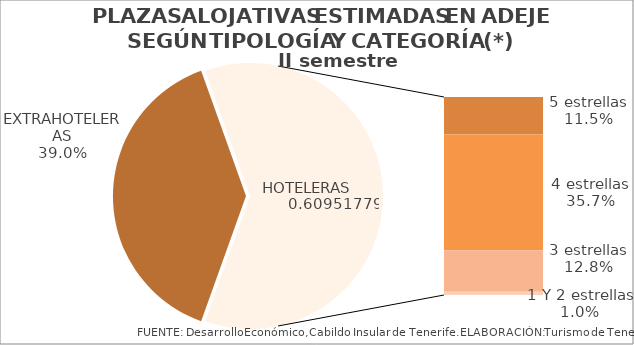
| Category | II semestre 2014 |
|---|---|
| EXTRAHOTELERAS | 0.39 |
| 5 estrellas | 0.115 |
| 4 estrellas | 0.357 |
| 3 estrellas | 0.128 |
| 1 Y 2 estrellas | 0.01 |